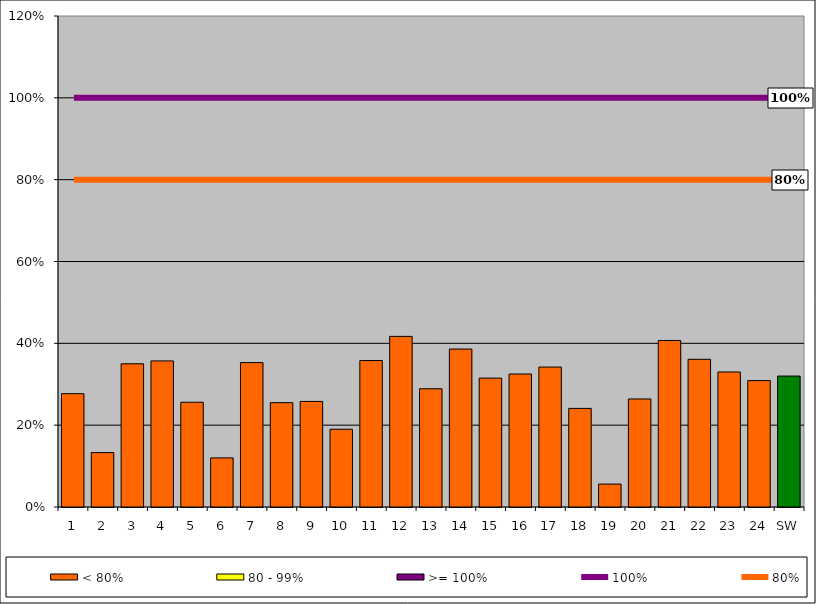
| Category | < 80% | 80 - 99% | >= 100% |
|---|---|---|---|
| 1 | 0.277 | 0 | 0 |
| 2 | 0.133 | 0 | 0 |
| 3 | 0.35 | 0 | 0 |
| 4 | 0.357 | 0 | 0 |
| 5 | 0.256 | 0 | 0 |
| 6 | 0.12 | 0 | 0 |
| 7 | 0.353 | 0 | 0 |
| 8 | 0.255 | 0 | 0 |
| 9 | 0.258 | 0 | 0 |
| 10 | 0.19 | 0 | 0 |
| 11 | 0.358 | 0 | 0 |
| 12 | 0.417 | 0 | 0 |
| 13 | 0.289 | 0 | 0 |
| 14 | 0.386 | 0 | 0 |
| 15 | 0.315 | 0 | 0 |
| 16 | 0.325 | 0 | 0 |
| 17 | 0.342 | 0 | 0 |
| 18 | 0.241 | 0 | 0 |
| 19 | 0.056 | 0 | 0 |
| 20 | 0.264 | 0 | 0 |
| 21 | 0.407 | 0 | 0 |
| 22 | 0.361 | 0 | 0 |
| 23 | 0.33 | 0 | 0 |
| 24 | 0.309 | 0 | 0 |
| SW | 0.32 | 0 | 0 |